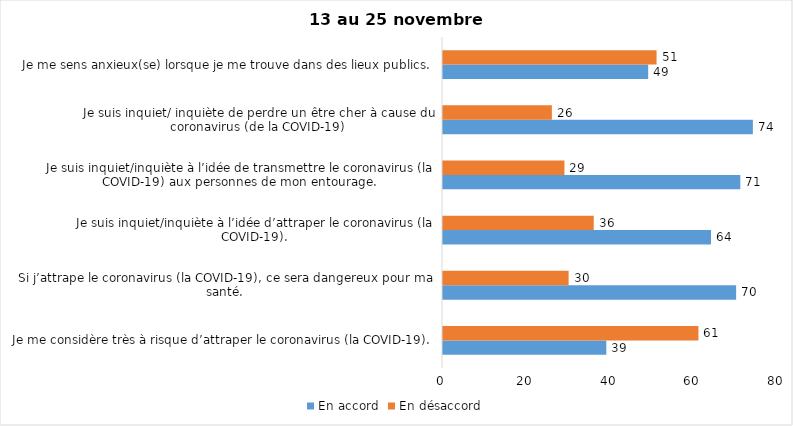
| Category | En accord | En désaccord |
|---|---|---|
| Je me considère très à risque d’attraper le coronavirus (la COVID-19). | 39 | 61 |
| Si j’attrape le coronavirus (la COVID-19), ce sera dangereux pour ma santé. | 70 | 30 |
| Je suis inquiet/inquiète à l’idée d’attraper le coronavirus (la COVID-19). | 64 | 36 |
| Je suis inquiet/inquiète à l’idée de transmettre le coronavirus (la COVID-19) aux personnes de mon entourage. | 71 | 29 |
| Je suis inquiet/ inquiète de perdre un être cher à cause du coronavirus (de la COVID-19) | 74 | 26 |
| Je me sens anxieux(se) lorsque je me trouve dans des lieux publics. | 49 | 51 |